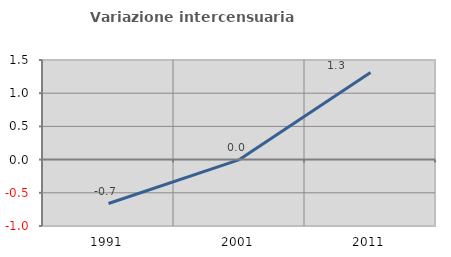
| Category | Variazione intercensuaria annua |
|---|---|
| 1991.0 | -0.661 |
| 2001.0 | 0 |
| 2011.0 | 1.31 |